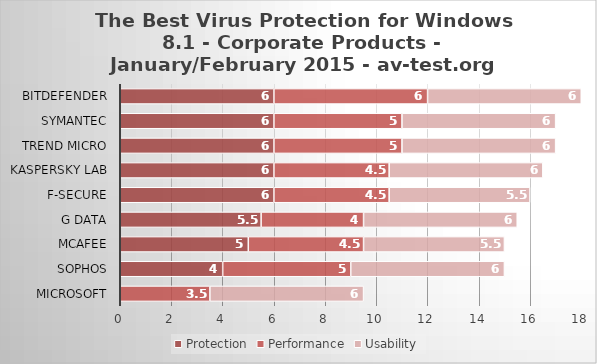
| Category | Protection | Performance | Usability |
|---|---|---|---|
| Microsoft | 0 | 3.5 | 6 |
| Sophos | 4 | 5 | 6 |
| McAfee | 5 | 4.5 | 5.5 |
| G Data | 5.5 | 4 | 6 |
| F-Secure | 6 | 4.5 | 5.5 |
| Kaspersky Lab | 6 | 4.5 | 6 |
| Trend Micro | 6 | 5 | 6 |
| Symantec | 6 | 5 | 6 |
| Bitdefender | 6 | 6 | 6 |